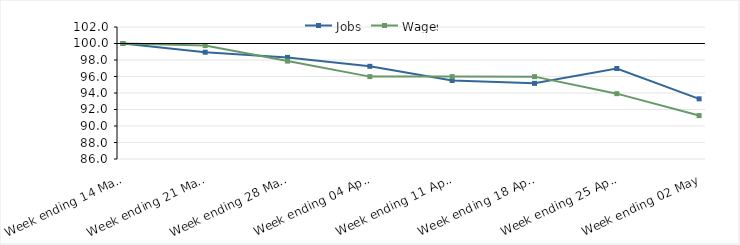
| Category | Jobs | Wages |
|---|---|---|
| 2020-03-14 | 100 | 100 |
| 2020-03-21 | 98.943 | 99.744 |
| 2020-03-28 | 98.312 | 97.867 |
| 2020-04-04 | 97.236 | 95.985 |
| 2020-04-11 | 95.519 | 95.986 |
| 2020-04-18 | 95.169 | 95.982 |
| 2020-04-25 | 96.968 | 93.921 |
| 2020-05-02 | 93.295 | 91.262 |